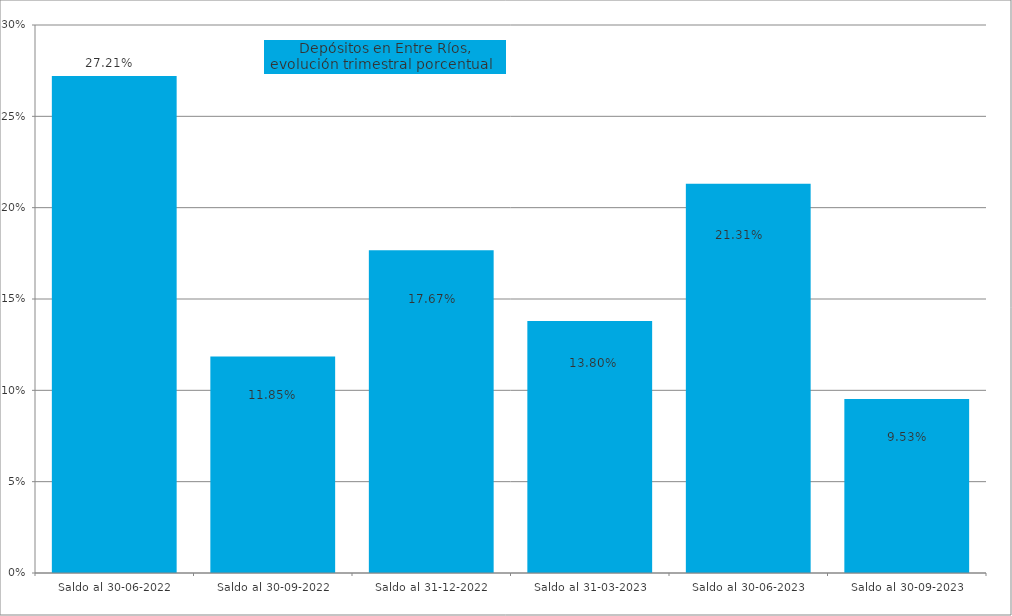
| Category | Series 0 |
|---|---|
| Saldo al 30-06-2022 | 0.272 |
| Saldo al 30-09-2022 | 0.118 |
| Saldo al 31-12-2022 | 0.177 |
| Saldo al 31-03-2023 | 0.138 |
| Saldo al 30-06-2023 | 0.213 |
| Saldo al 30-09-2023 | 0.095 |